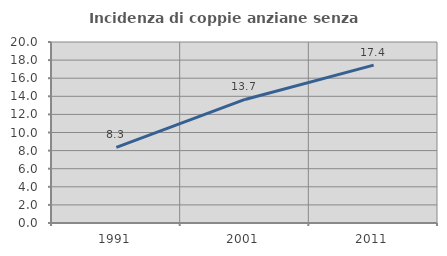
| Category | Incidenza di coppie anziane senza figli  |
|---|---|
| 1991.0 | 8.346 |
| 2001.0 | 13.65 |
| 2011.0 | 17.444 |